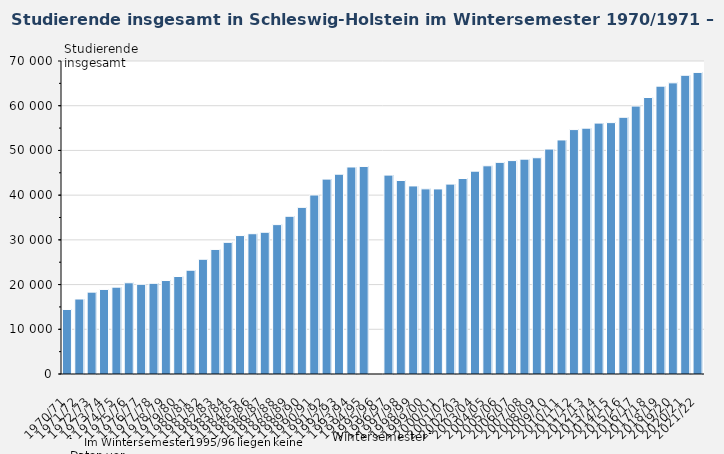
| Category | Studierende insgesamt |
|---|---|
| 1970/71 | 14430 |
| 1971/72 | 16770 |
| 1972/73 | 18306 |
| 1973/74 | 18912 |
| 1974/75 | 19425 |
| 1975/76 | 20397 |
| 1976/77 | 20064 |
| 1977/78 | 20277 |
| 1978/79 | 20907 |
| 1979/80 | 21804 |
| 1980/81 | 23208 |
| 1981/82 | 25662 |
| 1982/83 | 27864 |
| 1983/84 | 29442 |
| 1984/85 | 30963 |
| 1985/86 | 31371 |
| 1986/87 | 31698 |
| 1987/88 | 33408 |
| 1988/89 | 35271 |
| 1989/90 | 37266 |
| 1990/91 | 40035 |
| 1991/92 | 43584 |
| 1992/93 | 44685 |
| 1993/94 | 46296 |
| 1994/95 | 46413 |
| 1995/96 | 0 |
| 1996/97 | 44478 |
| 1997/98 | 43278 |
| 1998/99 | 42060 |
| 1999/00 | 41406 |
| 2000/01 | 41388 |
| 2001/02 | 42465 |
| 2002/03 | 43719 |
| 2003/04 | 45363 |
| 2004/05 | 46566 |
| 2005/06 | 47331 |
| 2006/07 | 47730 |
| 2007/08 | 48051 |
| 2008/09 | 48366 |
| 2009/10 | 50307 |
| 2010/11 | 52344 |
| 2011/12 | 54663 |
| 2012/13 | 54978 |
| 2013/14 | 56112 |
| 2014/15 | 56220 |
| 2015/16 | 57411 |
| 2016/17 | 59919 |
| 2017/18 | 61836 |
| 2018/19 | 64377 |
| 2019/20 | 65112 |
| 2020/21 | 66807 |
| 2021/22 | 67446 |